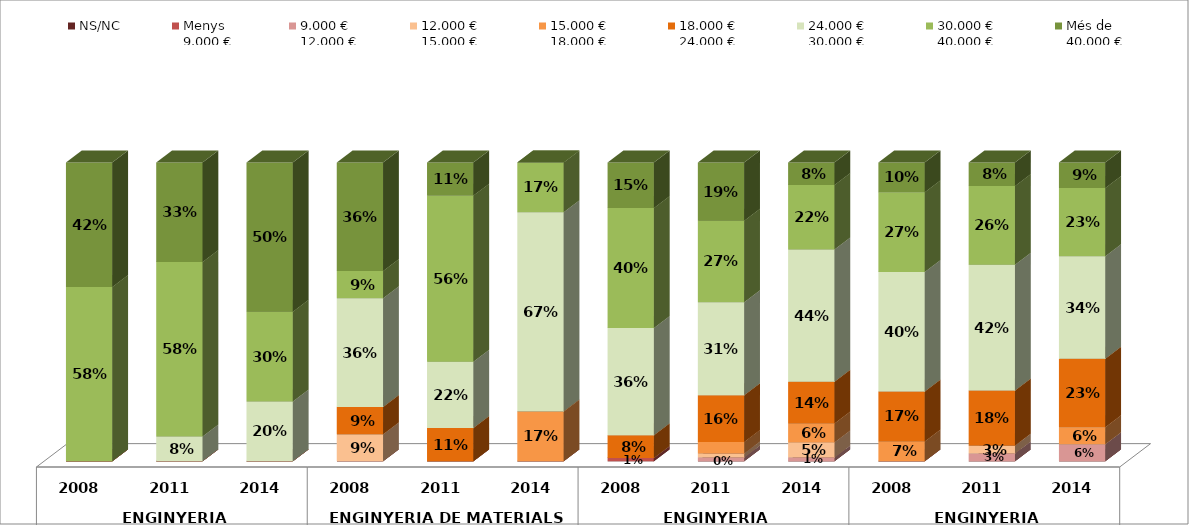
| Category | NS/NC | Menys 
9.000 € | 9.000 €
12.000 € | 12.000 €
15.000 € | 15.000 €
18.000 € | 18.000 €
24.000 € | 24.000 €
30.000 € | 30.000 €
40.000 € | Més de 
40.000 € |
|---|---|---|---|---|---|---|---|---|---|
| 0 | 0 | 0 | 0 | 0 | 0 | 0 | 0 | 0.583 | 0.417 |
| 1 | 0 | 0 | 0 | 0 | 0 | 0 | 0.083 | 0.583 | 0.333 |
| 2 | 0 | 0 | 0 | 0 | 0 | 0 | 0.2 | 0.3 | 0.5 |
| 3 | 0 | 0 | 0 | 0.091 | 0 | 0.091 | 0.364 | 0.091 | 0.364 |
| 4 | 0 | 0 | 0 | 0 | 0 | 0.111 | 0.222 | 0.556 | 0.111 |
| 5 | 0 | 0 | 0 | 0 | 0.167 | 0 | 0.667 | 0.167 | 0 |
| 6 | 0 | 0.011 | 0 | 0 | 0 | 0.076 | 0.359 | 0.402 | 0.152 |
| 7 | 0 | 0 | 0.013 | 0.013 | 0.039 | 0.156 | 0.312 | 0.273 | 0.195 |
| 8 | 0 | 0 | 0.013 | 0.051 | 0.063 | 0.139 | 0.443 | 0.215 | 0.076 |
| 9 | 0 | 0 | 0 | 0 | 0.067 | 0.167 | 0.4 | 0.267 | 0.1 |
| 10 | 0 | 0 | 0.026 | 0.026 | 0 | 0.184 | 0.421 | 0.263 | 0.079 |
| 11 | 0 | 0 | 0.057 | 0 | 0.057 | 0.229 | 0.343 | 0.229 | 0.086 |